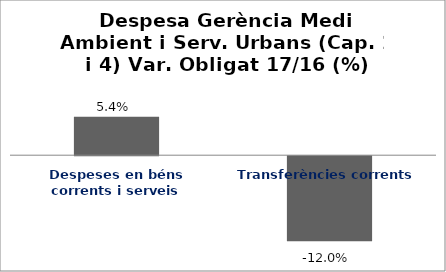
| Category | Series 0 |
|---|---|
| Despeses en béns corrents i serveis | 0.054 |
| Transferències corrents | -0.12 |